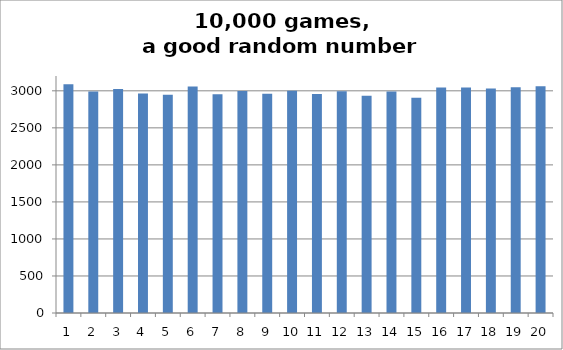
| Category | Series 0 |
|---|---|
| 0 | 3087 |
| 1 | 2991 |
| 2 | 3026 |
| 3 | 2964 |
| 4 | 2947 |
| 5 | 3059 |
| 6 | 2955 |
| 7 | 2998 |
| 8 | 2960 |
| 9 | 3002 |
| 10 | 2957 |
| 11 | 2994 |
| 12 | 2935 |
| 13 | 2991 |
| 14 | 2905 |
| 15 | 3045 |
| 16 | 3046 |
| 17 | 3030 |
| 18 | 3048 |
| 19 | 3060 |